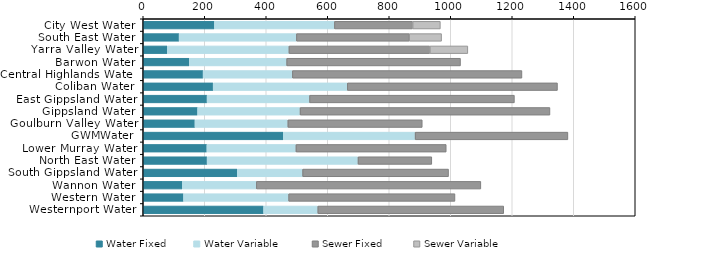
| Category | Water Fixed | Water Variable   | Sewer Fixed  | Sewer Variable   |
|---|---|---|---|---|
| City West Water | 231.47 | 390.324 | 254.33 | 90.143 |
| South East Water | 116.74 | 381.406 | 366.71 | 105.403 |
| Yarra Valley Water | 78.11 | 395.706 | 458.26 | 123.536 |
| Barwon Water | 149.79 | 316.695 | 565.34 | 0 |
| Central Highlands Water | 194.81 | 290.221 | 746.54 | 0 |
| Coliban Water | 227.47 | 436.124 | 683.56 | 0 |
| East Gippsland Water | 207.7 | 333.188 | 666.2 | 0 |
| Gippsland Water | 176.9 | 333.075 | 812.71 | 0 |
| Goulburn Valley Water | 168.27 | 302.09 | 437.02 | 0 |
| GWMWater | 455.45 | 428.725 | 496.91 | 0 |
| Lower Murray Water | 207.05 | 289.567 | 488.78 | 0 |
| North East Water | 207.82 | 490.631 | 239.97 | 0 |
| South Gippsland Water | 305.78 | 212.578 | 474.56 | 0 |
| Wannon Water | 127.12 | 240.738 | 730.08 | 0 |
| Western Water | 131.09 | 341.825 | 540.88 | 0 |
| Westernport Water | 391.48 | 176.249 | 604.65 | 0 |